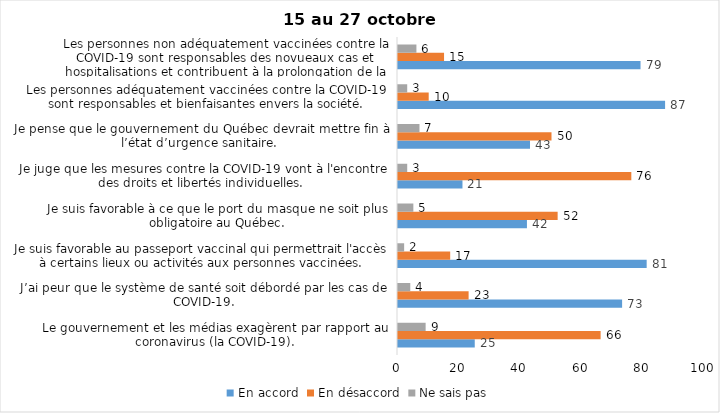
| Category | En accord | En désaccord | Ne sais pas |
|---|---|---|---|
| Le gouvernement et les médias exagèrent par rapport au coronavirus (la COVID-19). | 25 | 66 | 9 |
| J’ai peur que le système de santé soit débordé par les cas de COVID-19. | 73 | 23 | 4 |
| Je suis favorable au passeport vaccinal qui permettrait l'accès à certains lieux ou activités aux personnes vaccinées. | 81 | 17 | 2 |
| Je suis favorable à ce que le port du masque ne soit plus obligatoire au Québec. | 42 | 52 | 5 |
| Je juge que les mesures contre la COVID-19 vont à l'encontre des droits et libertés individuelles.  | 21 | 76 | 3 |
| Je pense que le gouvernement du Québec devrait mettre fin à l’état d’urgence sanitaire.  | 43 | 50 | 7 |
| Les personnes adéquatement vaccinées contre la COVID-19 sont responsables et bienfaisantes envers la société. | 87 | 10 | 3 |
| Les personnes non adéquatement vaccinées contre la COVID-19 sont responsables des novueaux cas et hospitalisations et contribuent à la prolongation de la pandémie au Québec. | 79 | 15 | 6 |